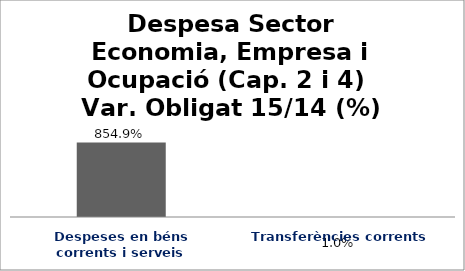
| Category | Series 0 |
|---|---|
| Despeses en béns corrents i serveis | 8.549 |
| Transferències corrents | 0.01 |